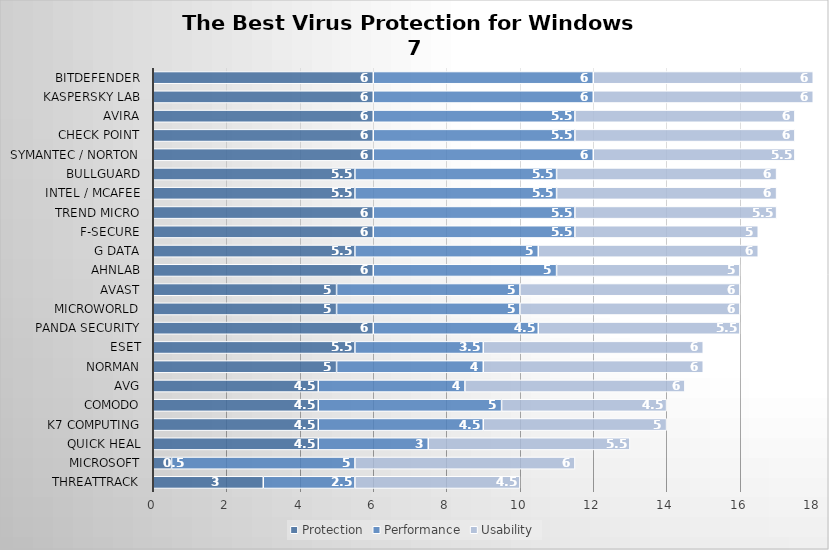
| Category | Protection | Performance | Usability |
|---|---|---|---|
| ThreatTrack | 3 | 2.5 | 4.5 |
| Microsoft | 0.5 | 5 | 6 |
| Quick Heal | 4.5 | 3 | 5.5 |
| K7 Computing | 4.5 | 4.5 | 5 |
| Comodo | 4.5 | 5 | 4.5 |
| AVG | 4.5 | 4 | 6 |
| Norman | 5 | 4 | 6 |
| ESET | 5.5 | 3.5 | 6 |
| Panda Security | 6 | 4.5 | 5.5 |
| Microworld | 5 | 5 | 6 |
| Avast | 5 | 5 | 6 |
| AhnLab | 6 | 5 | 5 |
| G Data | 5.5 | 5 | 6 |
| F-Secure | 6 | 5.5 | 5 |
| Trend Micro | 6 | 5.5 | 5.5 |
| Intel / McAfee | 5.5 | 5.5 | 6 |
| BullGuard | 5.5 | 5.5 | 6 |
| Symantec / Norton | 6 | 6 | 5.5 |
| Check Point | 6 | 5.5 | 6 |
| Avira | 6 | 5.5 | 6 |
| Kaspersky Lab | 6 | 6 | 6 |
| Bitdefender | 6 | 6 | 6 |